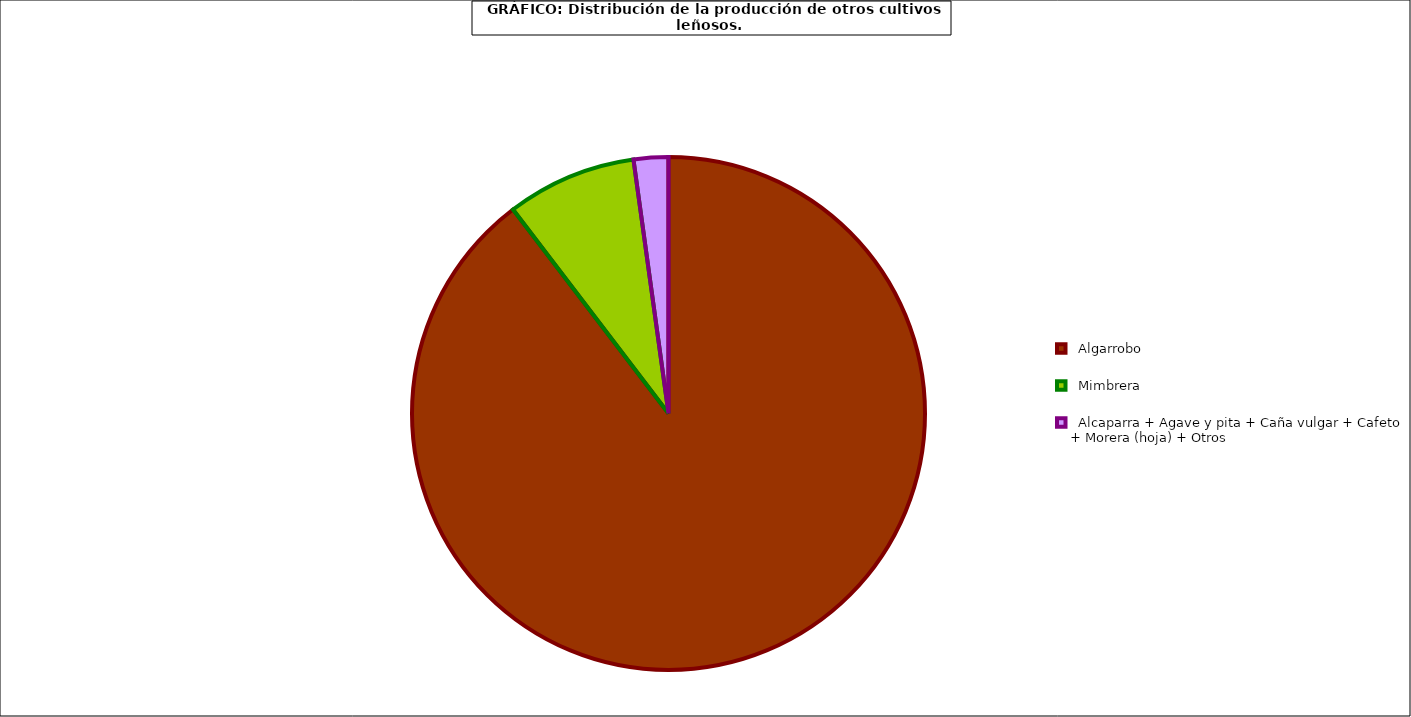
| Category | Series 0 |
|---|---|
|   Algarrobo | 52989 |
|   Mimbrera | 4839 |
|   Alcaparra + Agave y pita + Caña vulgar + Cafeto + Morera (hoja) + Otros | 1290 |